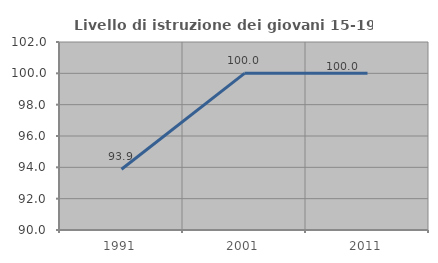
| Category | Livello di istruzione dei giovani 15-19 anni |
|---|---|
| 1991.0 | 93.878 |
| 2001.0 | 100 |
| 2011.0 | 100 |